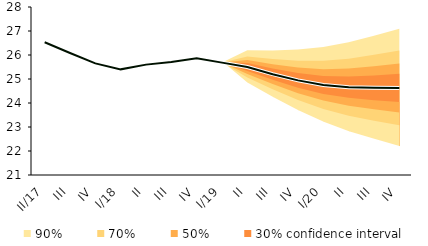
| Category | linka | Centerline |
|---|---|---|
| 0 | 26.532 | 26.532 |
| 1 | 26.084 | 26.084 |
| 2 | 25.651 | 25.651 |
| 3 | 25.402 | 25.402 |
| 4 | 25.599 | 25.599 |
| 5 | 25.711 | 25.711 |
| 6 | 25.862 | 25.862 |
| 7 | 25.682 | 25.682 |
| 8 | 25.5 | 25.5 |
| 9 | 25.201 | 25.201 |
| 10 | 24.942 | 24.942 |
| 11 | 24.754 | 24.754 |
| 12 | 24.66 | 24.66 |
| 13 | 24.634 | 24.634 |
| 14 | 24.629 | 24.629 |